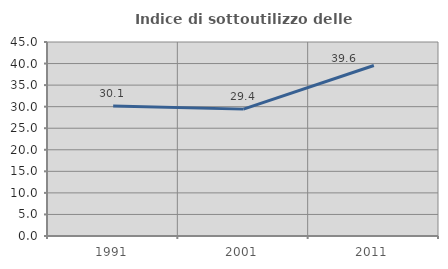
| Category | Indice di sottoutilizzo delle abitazioni  |
|---|---|
| 1991.0 | 30.147 |
| 2001.0 | 29.43 |
| 2011.0 | 39.552 |